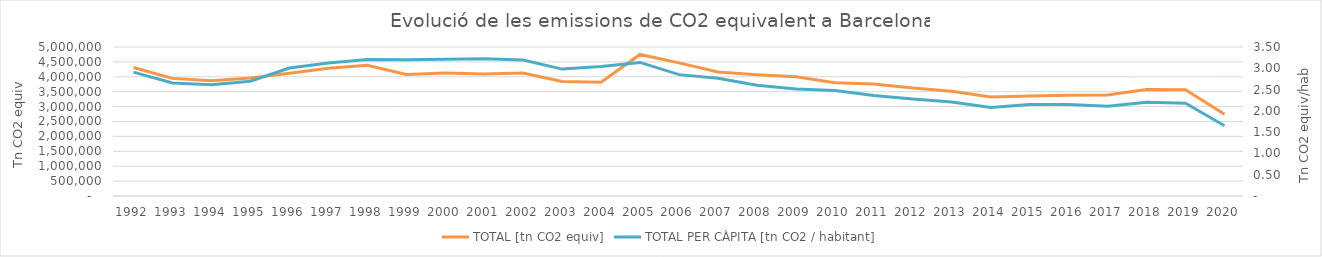
| Category | TOTAL [tn CO2 equiv] |
|---|---|
| 1992.0 | 4313002.656 |
| 1993.0 | 3946958.096 |
| 1994.0 | 3871592.383 |
| 1995.0 | 3957612.851 |
| 1996.0 | 4122822.866 |
| 1997.0 | 4286764.84 |
| 1998.0 | 4388835.954 |
| 1999.0 | 4077828.727 |
| 2000.0 | 4124276.87 |
| 2001.0 | 4095728.644 |
| 2002.0 | 4124103.461 |
| 2003.0 | 3844235.982 |
| 2004.0 | 3813979.479 |
| 2005.0 | 4750458.626 |
| 2006.0 | 4466791.612 |
| 2007.0 | 4162515.182 |
| 2008.0 | 4069539.023 |
| 2009.0 | 4005146.728 |
| 2010.0 | 3804295.098 |
| 2011.0 | 3760884.875 |
| 2012.0 | 3623187.529 |
| 2013.0 | 3512066.58 |
| 2014.0 | 3324422.467 |
| 2015.0 | 3358455.575 |
| 2016.0 | 3378868.097 |
| 2017.0 | 3391672.659 |
| 2018.0 | 3571586.519 |
| 2019.0 | 3566016.811 |
| 2020.0 | 2741711 |